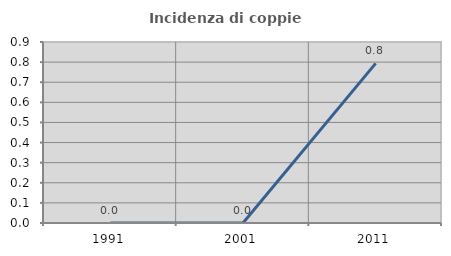
| Category | Incidenza di coppie miste |
|---|---|
| 1991.0 | 0 |
| 2001.0 | 0 |
| 2011.0 | 0.794 |